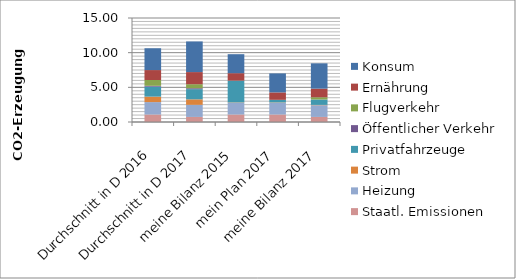
| Category | Staatl. Emissionen | Heizung | Strom | Privatfahrzeuge | Öffentlicher Verkehr | Flugverkehr | Ernährung | Konsum |
|---|---|---|---|---|---|---|---|---|
| Durchschnitt in D 2016 | 1.08 | 1.79 | 0.79 | 1.44 | 0.12 | 0.84 | 1.43 | 3.15 |
| Durchschnitt in D 2017 | 0.73 | 1.75 | 0.79 | 1.47 | 0.13 | 0.58 | 1.75 | 4.42 |
| meine Bilanz 2015 | 1.08 | 1.69 | 0.05 | 3.15 | 0 | 0 | 1.07 | 2.74 |
| mein Plan 2017 | 1.08 | 1.69 | 0.05 | 0.378 | 0 | 0 | 1.07 | 2.74 |
| meine Bilanz 2017 | 0.73 | 1.69 | 0.05 | 0.78 | 0 | 0.32 | 1.24 | 3.65 |